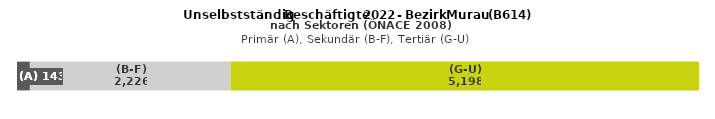
| Category | (A) | (B-F) | (G-U) |
|---|---|---|---|
| 0 | 143 | 2226 | 5198 |